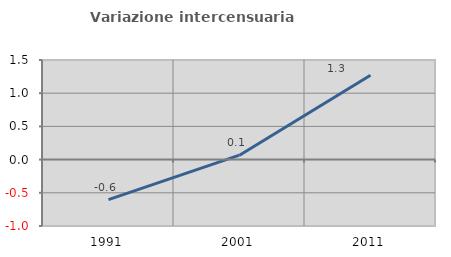
| Category | Variazione intercensuaria annua |
|---|---|
| 1991.0 | -0.604 |
| 2001.0 | 0.066 |
| 2011.0 | 1.27 |